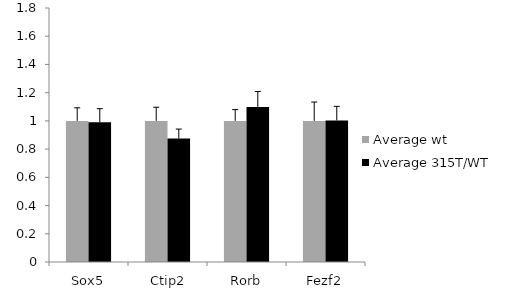
| Category | Average wt | Average 315T/WT |
|---|---|---|
|  Sox5 | 1 | 0.991 |
|  Ctip2 | 1 | 0.875 |
|  Rorb | 1 | 1.099 |
| Fezf2 | 1 | 1.003 |